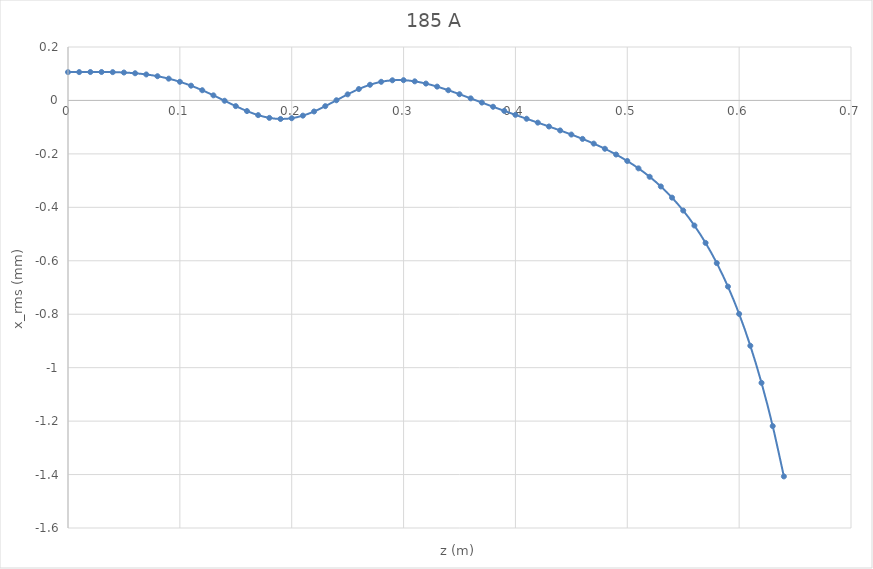
| Category | Series 0 |
|---|---|
| 0.0 | 0.106 |
| 0.01 | 0.106 |
| 0.02 | 0.106 |
| 0.03 | 0.106 |
| 0.04 | 0.106 |
| 0.05 | 0.105 |
| 0.06 | 0.102 |
| 0.07 | 0.097 |
| 0.08 | 0.091 |
| 0.09 | 0.082 |
| 0.1 | 0.07 |
| 0.11 | 0.055 |
| 0.12 | 0.038 |
| 0.13 | 0.019 |
| 0.14 | -0.001 |
| 0.15 | -0.021 |
| 0.16 | -0.04 |
| 0.17 | -0.055 |
| 0.18 | -0.065 |
| 0.19 | -0.069 |
| 0.2 | -0.066 |
| 0.21 | -0.057 |
| 0.22 | -0.041 |
| 0.23 | -0.021 |
| 0.24 | 0.001 |
| 0.25 | 0.023 |
| 0.26 | 0.043 |
| 0.27 | 0.059 |
| 0.28 | 0.07 |
| 0.29 | 0.075 |
| 0.3 | 0.076 |
| 0.31 | 0.071 |
| 0.32 | 0.063 |
| 0.33 | 0.052 |
| 0.34 | 0.038 |
| 0.35 | 0.023 |
| 0.36 | 0.008 |
| 0.37 | -0.008 |
| 0.38 | -0.024 |
| 0.39 | -0.039 |
| 0.4 | -0.054 |
| 0.41 | -0.069 |
| 0.42 | -0.083 |
| 0.43 | -0.098 |
| 0.44 | -0.112 |
| 0.45 | -0.128 |
| 0.46 | -0.144 |
| 0.47 | -0.162 |
| 0.48 | -0.181 |
| 0.49 | -0.202 |
| 0.5 | -0.227 |
| 0.51 | -0.254 |
| 0.52 | -0.286 |
| 0.53 | -0.322 |
| 0.54 | -0.364 |
| 0.55 | -0.412 |
| 0.56 | -0.468 |
| 0.57 | -0.533 |
| 0.58 | -0.609 |
| 0.59 | -0.697 |
| 0.6 | -0.799 |
| 0.61 | -0.918 |
| 0.62 | -1.057 |
| 0.63 | -1.219 |
| 0.64 | -1.407 |